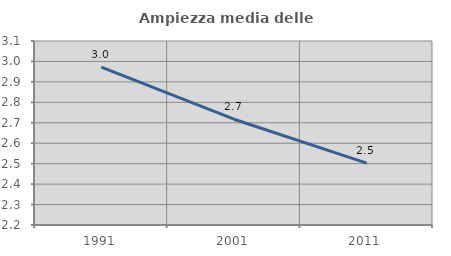
| Category | Ampiezza media delle famiglie |
|---|---|
| 1991.0 | 2.972 |
| 2001.0 | 2.717 |
| 2011.0 | 2.503 |